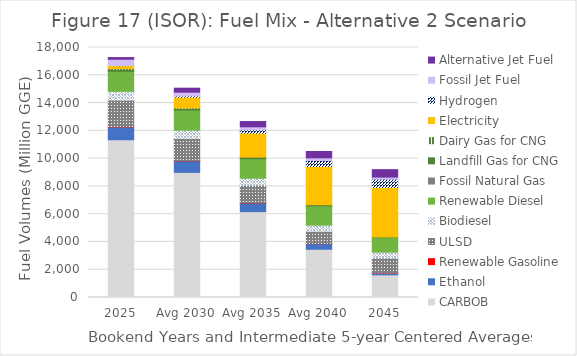
| Category | CARBOB | Ethanol | Renewable Gasoline | ULSD | Biodiesel | Renewable Diesel | Fossil Natural Gas | Landfill Gas for CNG | Dairy Gas for CNG | Electricity | Hydrogen | Fossil Jet Fuel | Alternative Jet Fuel |
|---|---|---|---|---|---|---|---|---|---|---|---|---|---|
| 2025 | 11357.795 | 913.355 | 14.062 | 1917.681 | 644.244 | 1439.591 | 0 | 145.419 | 48.452 | 213.013 | 5.314 | 455.722 | 120.981 |
| Avg 2030 | 9012.049 | 823.986 | 14.122 | 1611.409 | 586.649 | 1445.727 | 0 | 109.742 | 42.431 | 777.105 | 87.448 | 270.503 | 289.308 |
| Avg 2035 | 6181.999 | 609.626 | 13.662 | 1273.713 | 512.807 | 1398.616 | 0 | 116.57 | 0 | 1722.918 | 241.867 | 218.216 | 379.594 |
| Avg 2040 | 3474.026 | 404.539 | 13.554 | 882.45 | 435.621 | 1387.647 | 0 | 72.937 | 0 | 2762.485 | 436.496 | 186.788 | 457.558 |
| 2045 | 1632.638 | 124.439 | 10.282 | 1086.308 | 410.443 | 1052.585 | 0 | 32.937 | 0 | 3572.892 | 592.954 | 153.398 | 535.522 |